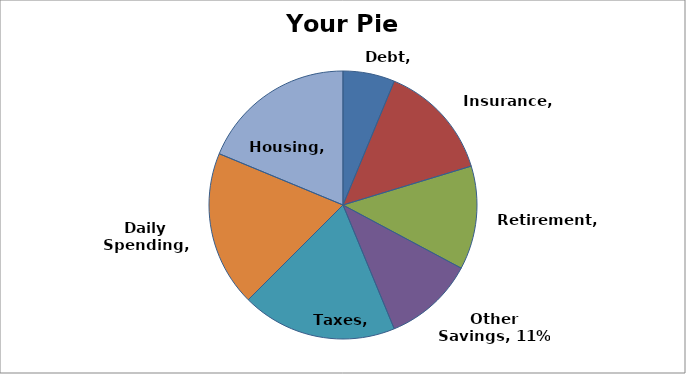
| Category | Series 0 |
|---|---|
| Debt | 0.062 |
| Insurance | 0.141 |
| Retirement | 0.125 |
| Other Savings | 0.109 |
| Taxes | 0.188 |
| Daily Spending | 0.188 |
| Housing | 0.188 |